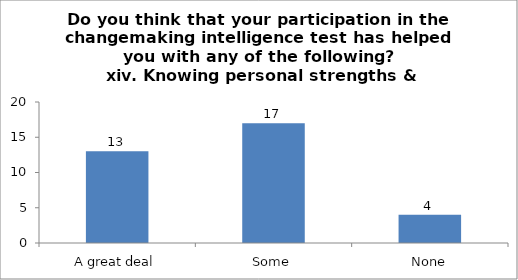
| Category | Do you think that your participation in the changemaking intelligence test has helped you with any of the following?
 xiv. Knowing personal strengths & weaknesses.   |
|---|---|
| A great deal | 13 |
| Some | 17 |
| None | 4 |